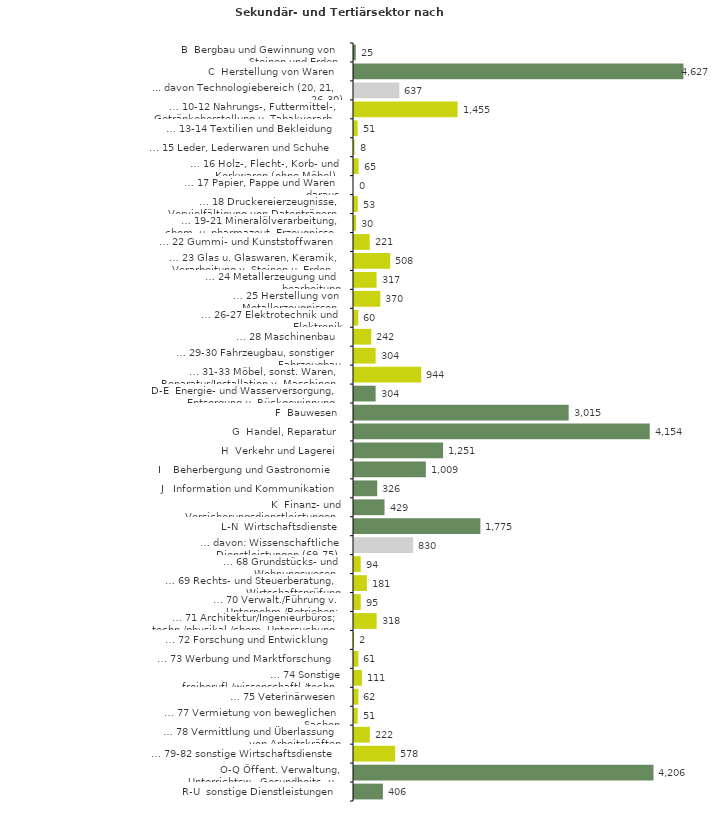
| Category | Series 0 |
|---|---|
| B  Bergbau und Gewinnung von Steinen und Erden | 25 |
| C  Herstellung von Waren | 4627 |
| ... davon Technologiebereich (20, 21, 26-30) | 637 |
| … 10-12 Nahrungs-, Futtermittel-, Getränkeherstellung u. Tabakverarb. | 1455 |
| … 13-14 Textilien und Bekleidung | 51 |
| … 15 Leder, Lederwaren und Schuhe | 8 |
| … 16 Holz-, Flecht-, Korb- und Korkwaren (ohne Möbel)  | 65 |
| … 17 Papier, Pappe und Waren daraus  | 0 |
| … 18 Druckereierzeugnisse, Vervielfältigung von Datenträgern | 53 |
| … 19-21 Mineralölverarbeitung, chem. u. pharmazeut. Erzeugnisse | 30 |
| … 22 Gummi- und Kunststoffwaren | 221 |
| … 23 Glas u. Glaswaren, Keramik, Verarbeitung v. Steinen u. Erden  | 508 |
| … 24 Metallerzeugung und -bearbeitung | 317 |
| … 25 Herstellung von Metallerzeugnissen  | 370 |
| … 26-27 Elektrotechnik und Elektronik | 60 |
| … 28 Maschinenbau | 242 |
| … 29-30 Fahrzeugbau, sonstiger Fahrzeugbau | 304 |
| … 31-33 Möbel, sonst. Waren, Reparatur/Installation v. Maschinen | 944 |
| D-E  Energie- und Wasserversorgung, Entsorgung u. Rückgewinnung | 304 |
| F  Bauwesen | 3015 |
| G  Handel, Reparatur | 4154 |
| H  Verkehr und Lagerei | 1251 |
| I    Beherbergung und Gastronomie | 1009 |
| J   Information und Kommunikation | 326 |
| K  Finanz- und Versicherungsdienstleistungen | 429 |
| L-N  Wirtschaftsdienste | 1775 |
| … davon: Wissenschaftliche Dienstleistungen (69-75) | 830 |
| … 68 Grundstücks- und Wohnungswesen  | 94 |
| … 69 Rechts- und Steuerberatung, Wirtschaftsprüfung | 181 |
| … 70 Verwalt./Führung v. Unternehm./Betrieben; Unternehmensberat. | 95 |
| … 71 Architektur/Ingenieurbüros; techn./physikal./chem. Untersuchung | 318 |
| … 72 Forschung und Entwicklung  | 2 |
| … 73 Werbung und Marktforschung | 61 |
| … 74 Sonstige freiberufl./wissenschaftl./techn. Tätigkeiten | 111 |
| … 75 Veterinärwesen | 62 |
| … 77 Vermietung von beweglichen Sachen  | 51 |
| … 78 Vermittlung und Überlassung von Arbeitskräften | 222 |
| … 79-82 sonstige Wirtschaftsdienste | 578 |
| O-Q Öffent. Verwaltung, Unterrichtsw., Gesundheits- u. Sozialwesen | 4206 |
| R-U  sonstige Dienstleistungen | 406 |